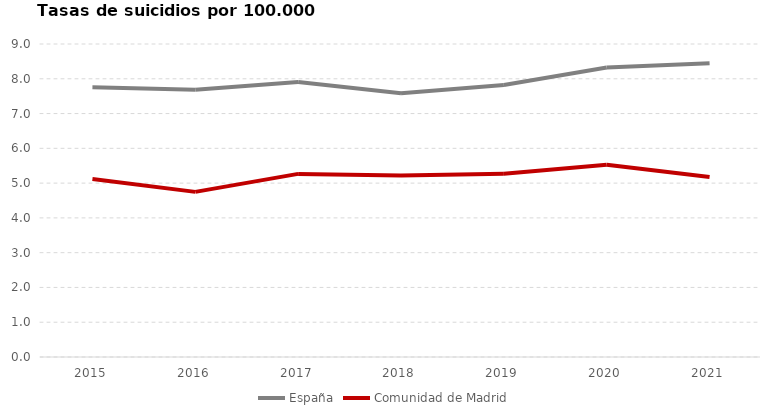
| Category | España | Comunidad de Madrid |
|---|---|---|
| 2015.0 | 7.755 | 5.121 |
| 2016.0 | 7.685 | 4.748 |
| 2017.0 | 7.907 | 5.265 |
| 2018.0 | 7.585 | 5.222 |
| 2019.0 | 7.821 | 5.27 |
| 2020.0 | 8.326 | 5.528 |
| 2021.0 | 8.445 | 5.173 |